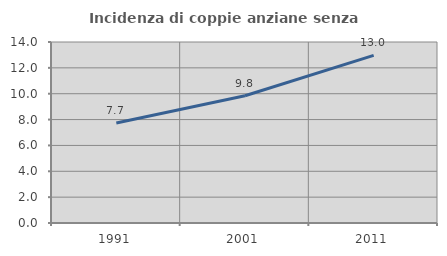
| Category | Incidenza di coppie anziane senza figli  |
|---|---|
| 1991.0 | 7.734 |
| 2001.0 | 9.84 |
| 2011.0 | 12.971 |